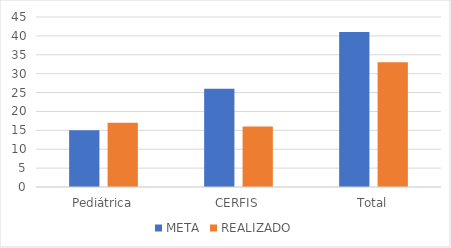
| Category | META | REALIZADO |
|---|---|---|
| Pediátrica | 15 | 17 |
| CERFIS | 26 | 16 |
| Total | 41 | 33 |